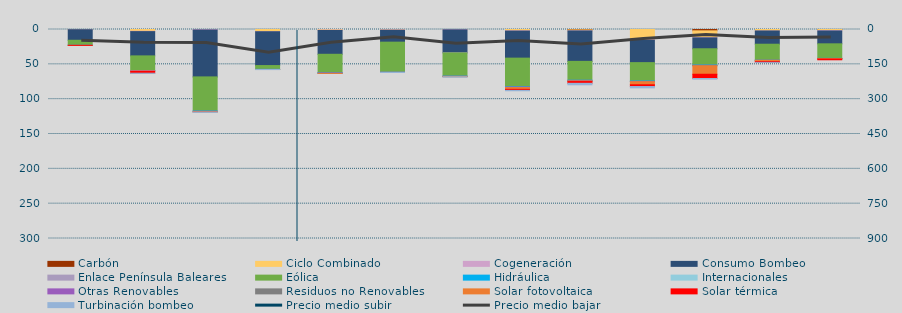
| Category | Carbón | Ciclo Combinado | Cogeneración | Consumo Bombeo | Enlace Península Baleares | Eólica | Hidráulica | Internacionales | Otras Renovables | Residuos no Renovables | Solar fotovoltaica | Solar térmica | Turbinación bombeo |
|---|---|---|---|---|---|---|---|---|---|---|---|---|---|
| 0 | 0 | 263.3 | 58 | 15135.8 | 0 | 6986.8 | 204.2 | 0 | 0 | 0 | 19.1 | 10 | 0 |
| 1 | 0 | 2541.1 | 504.6 | 34828.6 | 0 | 20974.2 | 56.9 | 0 | 659.6 | 0 | 686.2 | 2480.3 | 253.2 |
| 2 | 0 | 0 | 686.4 | 67342.6 | 0 | 49071.7 | 271.7 | 0 | 794.5 | 0 | 557.9 | 0 | 259.9 |
| 3 | 0 | 3064.1 | 163.7 | 48534.4 | 0 | 5474.1 | 38.8 | 0 | 117.5 | 0 | 22.5 | 0 | 130 |
| 4 | 0 | 754.5 | 626.3 | 34195.3 | 0 | 26304.6 | 431 | 0 | 574.8 | 3.9 | 78.7 | 0 | 0 |
| 5 | 0 | 527.6 | 537.7 | 17096.8 | 0 | 43158.6 | 57.1 | 0 | 178.1 | 0 | 29.6 | 0 | 157.5 |
| 6 | 0 | 33.9 | 492.3 | 32860 | 204 | 33430.9 | 70.8 | 0 | 339.4 | 109.7 | 324.3 | 0 | 570.1 |
| 7 | 0 | 1823.5 | 445.3 | 38830 | 0 | 40976.3 | 479.9 | 0 | 886 | 0.2 | 2434.6 | 1489.3 | 549.6 |
| 8 | 543 | 1288.6 | 238.655 | 43678.268 | 0 | 27098.515 | 150.455 | 0 | 982.208 | 13.2 | 761.432 | 2474.8 | 2164.5 |
| 9 | 0 | 14634.199 | 838.098 | 32075.867 | 0 | 26340.743 | 533.073 | 0 | 507.085 | 0 | 4421.722 | 2509.099 | 1924.625 |
| 10 | 1932.082 | 9683.392 | 448.406 | 15579.715 | 0 | 23351.965 | 345.088 | 0 | 633.184 | 108.783 | 12157.29 | 6064.342 | 913.05 |
| 11 | 0 | 2088.417 | 56.138 | 18984.933 | 0 | 23010.334 | 40.779 | 0 | 39.002 | 82.474 | 1741.959 | 1100.186 | 17.7 |
| 12 | 20 | 1489.042 | 599.786 | 18456.273 | 0 | 20881.86 | 87.748 | 0 | 304.724 | 12.55 | 573.462 | 1034.589 | 0 |